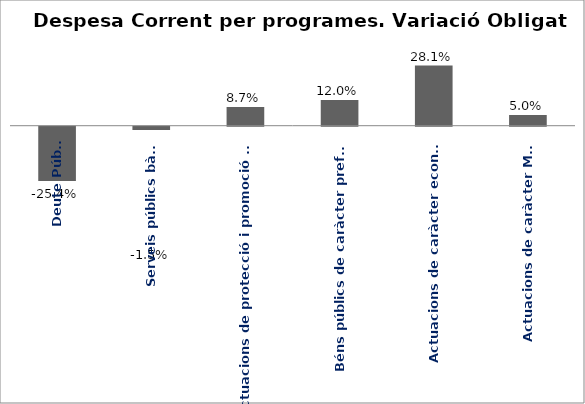
| Category | Series 0 |
|---|---|
| Deute Públic | -0.254 |
| Serveis públics bàsics | -0.015 |
| Actuacions de protecció i promoció social | 0.087 |
| Béns públics de caràcter preferent | 0.12 |
| Actuacions de caràcter econòmic | 0.281 |
| Actuacions de caràcter Marçal | 0.05 |